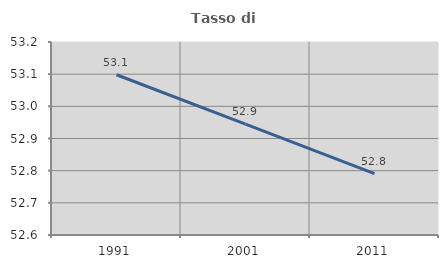
| Category | Tasso di occupazione   |
|---|---|
| 1991.0 | 53.098 |
| 2001.0 | 52.944 |
| 2011.0 | 52.791 |